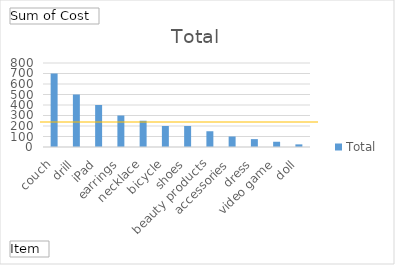
| Category | Total |
|---|---|
| couch | 700 |
| drill | 500 |
| iPad | 400 |
| earrings | 300 |
| necklace | 250 |
| bicycle | 200 |
| shoes | 200 |
| beauty products | 150 |
| accessories | 100 |
| dress | 75 |
| video game | 50 |
| doll | 25 |